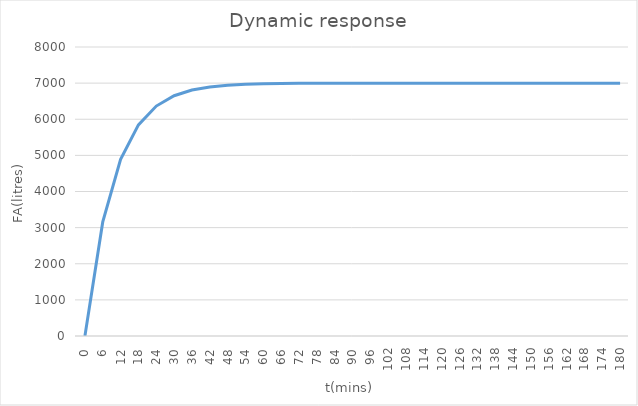
| Category | FA(litres) |
|---|---|
| 0.0 | 0 |
| 6.0 | 3158.319 |
| 12.0 | 4891.641 |
| 18.0 | 5842.908 |
| 24.0 | 6364.974 |
| 30.0 | 6651.491 |
| 36.0 | 6808.734 |
| 42.0 | 6895.031 |
| 48.0 | 6942.392 |
| 54.0 | 6968.384 |
| 60.0 | 6982.649 |
| 66.0 | 6990.477 |
| 72.0 | 6994.774 |
| 78.0 | 6997.132 |
| 84.0 | 6998.426 |
| 90.0 | 6999.136 |
| 96.0 | 6999.526 |
| 102.0 | 6999.74 |
| 108.0 | 6999.857 |
| 114.0 | 6999.922 |
| 120.0 | 6999.957 |
| 126.0 | 6999.976 |
| 132.0 | 6999.987 |
| 138.0 | 6999.993 |
| 144.0 | 6999.996 |
| 150.0 | 6999.998 |
| 156.0 | 6999.999 |
| 162.0 | 6999.999 |
| 168.0 | 7000 |
| 174.0 | 7000 |
| 180.0 | 7000 |